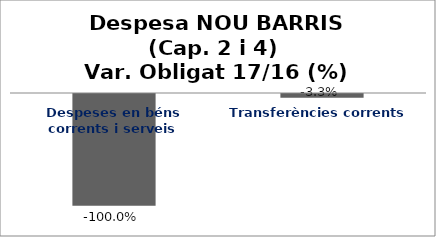
| Category | Series 0 |
|---|---|
| Despeses en béns corrents i serveis | -1 |
| Transferències corrents | -0.033 |